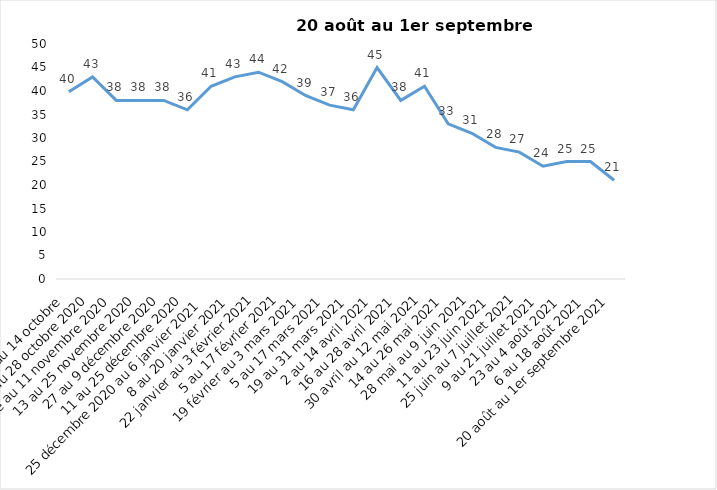
| Category | Toujours aux trois mesures |
|---|---|
| 2 au 14 octobre  | 39.85 |
| 16 au 28 octobre 2020 | 43 |
| 30 octobre au 11 novembre 2020 | 38 |
| 13 au 25 novembre 2020 | 38 |
| 27 au 9 décembre 2020 | 38 |
| 11 au 25 décembre 2020 | 36 |
| 25 décembre 2020 au 6 janvier 2021 | 41 |
| 8 au 20 janvier 2021 | 43 |
| 22 janvier au 3 février 2021 | 44 |
| 5 au 17 février 2021 | 42 |
| 19 février au 3 mars 2021 | 39 |
| 5 au 17 mars 2021 | 37 |
| 19 au 31 mars 2021 | 36 |
| 2 au 14 avril 2021 | 45 |
| 16 au 28 avril 2021 | 38 |
| 30 avril au 12 mai 2021 | 41 |
| 14 au 26 mai 2021 | 33 |
| 28 mai au 9 juin 2021 | 31 |
| 11 au 23 juin 2021 | 28 |
| 25 juin au 7 juillet 2021 | 27 |
| 9 au 21 juillet 2021 | 24 |
| 23 au 4 août 2021 | 25 |
| 6 au 18 août 2021 | 25 |
| 20 août au 1er septembre 2021 | 21 |